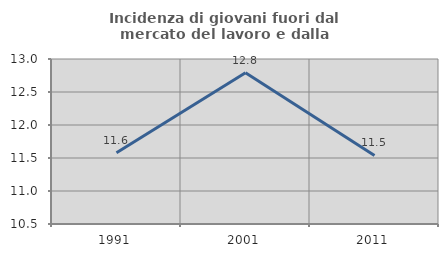
| Category | Incidenza di giovani fuori dal mercato del lavoro e dalla formazione  |
|---|---|
| 1991.0 | 11.579 |
| 2001.0 | 12.791 |
| 2011.0 | 11.538 |